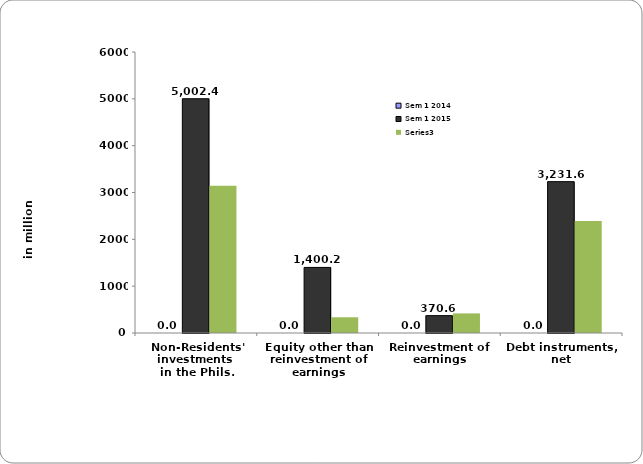
| Category | Sem 1 2014 | Sem 1 2015 | Series 2 |
|---|---|---|---|
| Non-Residents' investments 
in the Phils. |  | 5002.42 | 3145.029 |
| Equity other than reinvestment of earnings |  | 1400.167 | 335.829 |
| Reinvestment of earnings |  | 370.612 | 418.431 |
| Debt instruments, net |  | 3231.64 | 2390.769 |